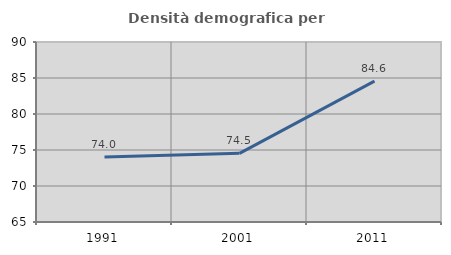
| Category | Densità demografica |
|---|---|
| 1991.0 | 74.045 |
| 2001.0 | 74.537 |
| 2011.0 | 84.567 |